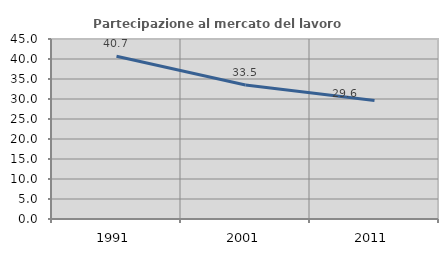
| Category | Partecipazione al mercato del lavoro  femminile |
|---|---|
| 1991.0 | 40.679 |
| 2001.0 | 33.515 |
| 2011.0 | 29.636 |